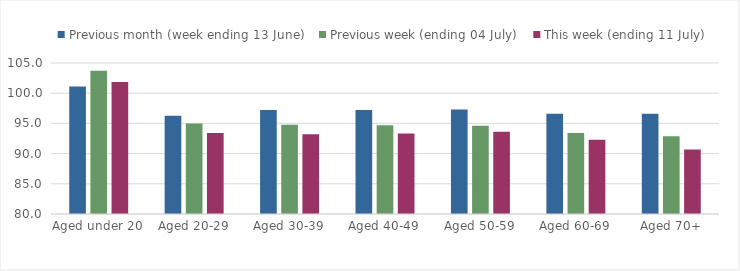
| Category | Previous month (week ending 13 June) | Previous week (ending 04 July) | This week (ending 11 July) |
|---|---|---|---|
| Aged under 20 | 101.096 | 103.736 | 101.834 |
| Aged 20-29 | 96.273 | 94.994 | 93.398 |
| Aged 30-39 | 97.237 | 94.784 | 93.201 |
| Aged 40-49 | 97.199 | 94.674 | 93.316 |
| Aged 50-59 | 97.293 | 94.621 | 93.616 |
| Aged 60-69 | 96.602 | 93.405 | 92.283 |
| Aged 70+ | 96.613 | 92.869 | 90.693 |